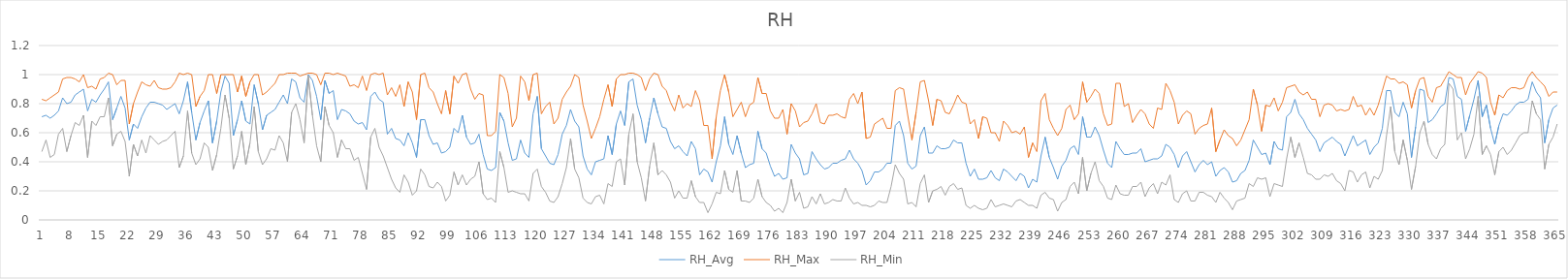
| Category | RH_Avg | RH_Max | RH_Min |
|---|---|---|---|
| 0 | 0.71 | 0.83 | 0.47 |
| 1 | 0.72 | 0.82 | 0.55 |
| 2 | 0.7 | 0.84 | 0.43 |
| 3 | 0.72 | 0.86 | 0.45 |
| 4 | 0.75 | 0.88 | 0.59 |
| 5 | 0.84 | 0.97 | 0.63 |
| 6 | 0.8 | 0.98 | 0.47 |
| 7 | 0.81 | 0.98 | 0.58 |
| 8 | 0.86 | 0.97 | 0.67 |
| 9 | 0.88 | 0.95 | 0.65 |
| 10 | 0.9 | 1 | 0.72 |
| 11 | 0.75 | 0.91 | 0.43 |
| 12 | 0.83 | 0.92 | 0.68 |
| 13 | 0.81 | 0.9 | 0.65 |
| 14 | 0.86 | 0.97 | 0.71 |
| 15 | 0.9 | 0.98 | 0.71 |
| 16 | 0.95 | 1.01 | 0.84 |
| 17 | 0.69 | 1 | 0.51 |
| 18 | 0.77 | 0.93 | 0.59 |
| 19 | 0.85 | 0.96 | 0.61 |
| 20 | 0.77 | 0.96 | 0.54 |
| 21 | 0.55 | 0.66 | 0.3 |
| 22 | 0.66 | 0.8 | 0.52 |
| 23 | 0.63 | 0.88 | 0.44 |
| 24 | 0.71 | 0.95 | 0.55 |
| 25 | 0.77 | 0.93 | 0.46 |
| 26 | 0.81 | 0.92 | 0.58 |
| 27 | 0.81 | 0.96 | 0.55 |
| 28 | 0.8 | 0.91 | 0.52 |
| 29 | 0.79 | 0.9 | 0.54 |
| 30 | 0.76 | 0.9 | 0.55 |
| 31 | 0.78 | 0.91 | 0.58 |
| 32 | 0.8 | 0.95 | 0.61 |
| 33 | 0.73 | 1.01 | 0.36 |
| 34 | 0.82 | 1 | 0.44 |
| 35 | 0.95 | 1.01 | 0.75 |
| 36 | 0.74 | 1 | 0.46 |
| 37 | 0.55 | 0.78 | 0.38 |
| 38 | 0.67 | 0.85 | 0.42 |
| 39 | 0.75 | 0.89 | 0.53 |
| 40 | 0.82 | 1 | 0.5 |
| 41 | 0.53 | 1 | 0.34 |
| 42 | 0.68 | 0.87 | 0.45 |
| 43 | 0.88 | 1 | 0.63 |
| 44 | 0.99 | 1 | 0.86 |
| 45 | 0.94 | 1 | 0.7 |
| 46 | 0.58 | 1 | 0.35 |
| 47 | 0.69 | 0.88 | 0.44 |
| 48 | 0.82 | 0.99 | 0.61 |
| 49 | 0.68 | 0.85 | 0.38 |
| 50 | 0.66 | 0.95 | 0.53 |
| 51 | 0.93 | 1 | 0.78 |
| 52 | 0.8 | 1 | 0.47 |
| 53 | 0.62 | 0.86 | 0.38 |
| 54 | 0.72 | 0.88 | 0.42 |
| 55 | 0.74 | 0.91 | 0.49 |
| 56 | 0.76 | 0.94 | 0.48 |
| 57 | 0.81 | 1 | 0.58 |
| 58 | 0.86 | 1 | 0.53 |
| 59 | 0.8 | 1.01 | 0.4 |
| 60 | 0.97 | 1.01 | 0.74 |
| 61 | 0.95 | 1.01 | 0.8 |
| 62 | 0.84 | 0.99 | 0.69 |
| 63 | 0.81 | 1 | 0.53 |
| 64 | 1 | 1.01 | 0.99 |
| 65 | 0.96 | 1.01 | 0.72 |
| 66 | 0.85 | 1 | 0.51 |
| 67 | 0.69 | 0.93 | 0.4 |
| 68 | 0.96 | 1.01 | 0.78 |
| 69 | 0.87 | 1.01 | 0.65 |
| 70 | 0.89 | 1 | 0.6 |
| 71 | 0.69 | 1.01 | 0.43 |
| 72 | 0.76 | 1 | 0.55 |
| 73 | 0.75 | 0.99 | 0.49 |
| 74 | 0.73 | 0.92 | 0.49 |
| 75 | 0.68 | 0.93 | 0.41 |
| 76 | 0.66 | 0.91 | 0.43 |
| 77 | 0.67 | 0.99 | 0.32 |
| 78 | 0.62 | 0.89 | 0.21 |
| 79 | 0.85 | 1 | 0.57 |
| 80 | 0.88 | 1.01 | 0.63 |
| 81 | 0.83 | 1 | 0.5 |
| 82 | 0.81 | 1.01 | 0.44 |
| 83 | 0.59 | 0.86 | 0.36 |
| 84 | 0.63 | 0.91 | 0.28 |
| 85 | 0.56 | 0.85 | 0.22 |
| 86 | 0.55 | 0.93 | 0.19 |
| 87 | 0.51 | 0.78 | 0.31 |
| 88 | 0.6 | 0.95 | 0.26 |
| 89 | 0.53 | 0.88 | 0.17 |
| 90 | 0.43 | 0.69 | 0.2 |
| 91 | 0.69 | 1 | 0.35 |
| 92 | 0.69 | 1.01 | 0.31 |
| 93 | 0.58 | 0.91 | 0.23 |
| 94 | 0.52 | 0.88 | 0.22 |
| 95 | 0.53 | 0.8 | 0.26 |
| 96 | 0.46 | 0.73 | 0.23 |
| 97 | 0.47 | 0.89 | 0.13 |
| 98 | 0.5 | 0.73 | 0.17 |
| 99 | 0.63 | 0.99 | 0.33 |
| 100 | 0.6 | 0.94 | 0.24 |
| 101 | 0.72 | 1 | 0.31 |
| 102 | 0.57 | 1.01 | 0.24 |
| 103 | 0.52 | 0.9 | 0.28 |
| 104 | 0.53 | 0.83 | 0.3 |
| 105 | 0.59 | 0.87 | 0.4 |
| 106 | 0.45 | 0.86 | 0.18 |
| 107 | 0.35 | 0.58 | 0.14 |
| 108 | 0.34 | 0.58 | 0.15 |
| 109 | 0.36 | 0.61 | 0.12 |
| 110 | 0.74 | 1 | 0.47 |
| 111 | 0.68 | 0.98 | 0.36 |
| 112 | 0.53 | 0.87 | 0.19 |
| 113 | 0.41 | 0.64 | 0.2 |
| 114 | 0.42 | 0.7 | 0.19 |
| 115 | 0.55 | 0.99 | 0.18 |
| 116 | 0.46 | 0.95 | 0.18 |
| 117 | 0.43 | 0.82 | 0.13 |
| 118 | 0.73 | 1 | 0.32 |
| 119 | 0.85 | 1.01 | 0.35 |
| 120 | 0.49 | 0.73 | 0.23 |
| 121 | 0.44 | 0.78 | 0.19 |
| 122 | 0.39 | 0.81 | 0.13 |
| 123 | 0.38 | 0.66 | 0.12 |
| 124 | 0.45 | 0.7 | 0.16 |
| 125 | 0.59 | 0.83 | 0.25 |
| 126 | 0.65 | 0.88 | 0.36 |
| 127 | 0.76 | 0.92 | 0.56 |
| 128 | 0.68 | 1 | 0.35 |
| 129 | 0.64 | 0.98 | 0.29 |
| 130 | 0.44 | 0.79 | 0.15 |
| 131 | 0.35 | 0.68 | 0.12 |
| 132 | 0.31 | 0.56 | 0.11 |
| 133 | 0.4 | 0.63 | 0.16 |
| 134 | 0.41 | 0.71 | 0.17 |
| 135 | 0.42 | 0.83 | 0.11 |
| 136 | 0.58 | 0.93 | 0.25 |
| 137 | 0.45 | 0.78 | 0.23 |
| 138 | 0.66 | 0.97 | 0.4 |
| 139 | 0.75 | 1 | 0.42 |
| 140 | 0.65 | 1 | 0.24 |
| 141 | 0.95 | 1.01 | 0.59 |
| 142 | 0.97 | 1.01 | 0.73 |
| 143 | 0.79 | 1 | 0.4 |
| 144 | 0.69 | 0.98 | 0.29 |
| 145 | 0.53 | 0.89 | 0.13 |
| 146 | 0.7 | 0.97 | 0.37 |
| 147 | 0.84 | 1.01 | 0.53 |
| 148 | 0.73 | 1 | 0.31 |
| 149 | 0.64 | 0.92 | 0.34 |
| 150 | 0.63 | 0.89 | 0.31 |
| 151 | 0.54 | 0.81 | 0.26 |
| 152 | 0.49 | 0.75 | 0.15 |
| 153 | 0.51 | 0.86 | 0.2 |
| 154 | 0.47 | 0.77 | 0.15 |
| 155 | 0.44 | 0.8 | 0.15 |
| 156 | 0.54 | 0.78 | 0.27 |
| 157 | 0.49 | 0.89 | 0.16 |
| 158 | 0.31 | 0.82 | 0.12 |
| 159 | 0.35 | 0.65 | 0.12 |
| 160 | 0.33 | 0.65 | 0.05 |
| 161 | 0.26 | 0.42 | 0.11 |
| 162 | 0.4 | 0.71 | 0.19 |
| 163 | 0.51 | 0.89 | 0.18 |
| 164 | 0.71 | 1 | 0.34 |
| 165 | 0.52 | 0.88 | 0.21 |
| 166 | 0.45 | 0.71 | 0.19 |
| 167 | 0.58 | 0.76 | 0.34 |
| 168 | 0.46 | 0.81 | 0.13 |
| 169 | 0.36 | 0.71 | 0.13 |
| 170 | 0.38 | 0.79 | 0.12 |
| 171 | 0.39 | 0.81 | 0.15 |
| 172 | 0.61 | 0.98 | 0.28 |
| 173 | 0.49 | 0.87 | 0.16 |
| 174 | 0.46 | 0.87 | 0.12 |
| 175 | 0.37 | 0.75 | 0.1 |
| 176 | 0.3 | 0.7 | 0.06 |
| 177 | 0.32 | 0.7 | 0.08 |
| 178 | 0.28 | 0.76 | 0.05 |
| 179 | 0.29 | 0.59 | 0.12 |
| 180 | 0.52 | 0.8 | 0.28 |
| 181 | 0.46 | 0.75 | 0.13 |
| 182 | 0.42 | 0.64 | 0.19 |
| 183 | 0.31 | 0.67 | 0.08 |
| 184 | 0.32 | 0.68 | 0.09 |
| 185 | 0.47 | 0.73 | 0.16 |
| 186 | 0.42 | 0.8 | 0.11 |
| 187 | 0.38 | 0.67 | 0.18 |
| 188 | 0.35 | 0.66 | 0.11 |
| 189 | 0.36 | 0.72 | 0.12 |
| 190 | 0.39 | 0.72 | 0.14 |
| 191 | 0.39 | 0.73 | 0.13 |
| 192 | 0.41 | 0.71 | 0.13 |
| 193 | 0.42 | 0.7 | 0.22 |
| 194 | 0.48 | 0.83 | 0.15 |
| 195 | 0.42 | 0.87 | 0.11 |
| 196 | 0.39 | 0.8 | 0.12 |
| 197 | 0.34 | 0.88 | 0.1 |
| 198 | 0.24 | 0.56 | 0.1 |
| 199 | 0.27 | 0.57 | 0.09 |
| 200 | 0.33 | 0.66 | 0.1 |
| 201 | 0.33 | 0.68 | 0.13 |
| 202 | 0.35 | 0.7 | 0.12 |
| 203 | 0.39 | 0.63 | 0.12 |
| 204 | 0.39 | 0.63 | 0.23 |
| 205 | 0.65 | 0.89 | 0.38 |
| 206 | 0.68 | 0.91 | 0.32 |
| 207 | 0.58 | 0.9 | 0.28 |
| 208 | 0.39 | 0.72 | 0.11 |
| 209 | 0.35 | 0.55 | 0.12 |
| 210 | 0.37 | 0.74 | 0.09 |
| 211 | 0.58 | 0.95 | 0.25 |
| 212 | 0.64 | 0.96 | 0.31 |
| 213 | 0.46 | 0.82 | 0.12 |
| 214 | 0.46 | 0.65 | 0.2 |
| 215 | 0.51 | 0.83 | 0.21 |
| 216 | 0.49 | 0.82 | 0.23 |
| 217 | 0.49 | 0.74 | 0.17 |
| 218 | 0.5 | 0.73 | 0.23 |
| 219 | 0.55 | 0.79 | 0.25 |
| 220 | 0.53 | 0.86 | 0.21 |
| 221 | 0.53 | 0.81 | 0.22 |
| 222 | 0.39 | 0.8 | 0.1 |
| 223 | 0.3 | 0.66 | 0.08 |
| 224 | 0.35 | 0.69 | 0.1 |
| 225 | 0.28 | 0.56 | 0.08 |
| 226 | 0.28 | 0.71 | 0.07 |
| 227 | 0.29 | 0.7 | 0.08 |
| 228 | 0.34 | 0.6 | 0.14 |
| 229 | 0.29 | 0.6 | 0.09 |
| 230 | 0.27 | 0.54 | 0.1 |
| 231 | 0.35 | 0.68 | 0.11 |
| 232 | 0.33 | 0.65 | 0.1 |
| 233 | 0.3 | 0.6 | 0.09 |
| 234 | 0.27 | 0.61 | 0.13 |
| 235 | 0.32 | 0.59 | 0.14 |
| 236 | 0.3 | 0.64 | 0.12 |
| 237 | 0.22 | 0.43 | 0.1 |
| 238 | 0.28 | 0.53 | 0.1 |
| 239 | 0.26 | 0.47 | 0.08 |
| 240 | 0.44 | 0.82 | 0.17 |
| 241 | 0.57 | 0.87 | 0.19 |
| 242 | 0.43 | 0.69 | 0.15 |
| 243 | 0.36 | 0.63 | 0.14 |
| 244 | 0.28 | 0.58 | 0.06 |
| 245 | 0.37 | 0.63 | 0.12 |
| 246 | 0.41 | 0.76 | 0.14 |
| 247 | 0.49 | 0.79 | 0.23 |
| 248 | 0.51 | 0.69 | 0.26 |
| 249 | 0.45 | 0.73 | 0.18 |
| 250 | 0.71 | 0.95 | 0.43 |
| 251 | 0.57 | 0.81 | 0.2 |
| 252 | 0.57 | 0.85 | 0.32 |
| 253 | 0.64 | 0.9 | 0.4 |
| 254 | 0.58 | 0.87 | 0.27 |
| 255 | 0.48 | 0.73 | 0.23 |
| 256 | 0.39 | 0.65 | 0.15 |
| 257 | 0.36 | 0.66 | 0.14 |
| 258 | 0.54 | 0.94 | 0.24 |
| 259 | 0.49 | 0.94 | 0.18 |
| 260 | 0.45 | 0.78 | 0.17 |
| 261 | 0.45 | 0.8 | 0.17 |
| 262 | 0.46 | 0.67 | 0.23 |
| 263 | 0.46 | 0.72 | 0.23 |
| 264 | 0.49 | 0.76 | 0.26 |
| 265 | 0.4 | 0.73 | 0.16 |
| 266 | 0.41 | 0.66 | 0.22 |
| 267 | 0.42 | 0.63 | 0.25 |
| 268 | 0.42 | 0.77 | 0.18 |
| 269 | 0.44 | 0.76 | 0.26 |
| 270 | 0.52 | 0.94 | 0.24 |
| 271 | 0.5 | 0.89 | 0.31 |
| 272 | 0.45 | 0.81 | 0.14 |
| 273 | 0.36 | 0.66 | 0.12 |
| 274 | 0.44 | 0.72 | 0.18 |
| 275 | 0.47 | 0.75 | 0.2 |
| 276 | 0.4 | 0.73 | 0.13 |
| 277 | 0.33 | 0.59 | 0.13 |
| 278 | 0.38 | 0.63 | 0.19 |
| 279 | 0.41 | 0.65 | 0.19 |
| 280 | 0.38 | 0.66 | 0.17 |
| 281 | 0.4 | 0.77 | 0.16 |
| 282 | 0.3 | 0.47 | 0.12 |
| 283 | 0.34 | 0.55 | 0.19 |
| 284 | 0.36 | 0.62 | 0.15 |
| 285 | 0.33 | 0.58 | 0.12 |
| 286 | 0.26 | 0.56 | 0.07 |
| 287 | 0.27 | 0.51 | 0.13 |
| 288 | 0.32 | 0.55 | 0.14 |
| 289 | 0.34 | 0.62 | 0.15 |
| 290 | 0.41 | 0.69 | 0.25 |
| 291 | 0.55 | 0.9 | 0.23 |
| 292 | 0.5 | 0.79 | 0.29 |
| 293 | 0.45 | 0.61 | 0.28 |
| 294 | 0.46 | 0.79 | 0.29 |
| 295 | 0.38 | 0.78 | 0.16 |
| 296 | 0.54 | 0.84 | 0.25 |
| 297 | 0.49 | 0.75 | 0.24 |
| 298 | 0.48 | 0.81 | 0.23 |
| 299 | 0.71 | 0.91 | 0.42 |
| 300 | 0.74 | 0.92 | 0.57 |
| 301 | 0.83 | 0.93 | 0.43 |
| 302 | 0.73 | 0.88 | 0.53 |
| 303 | 0.69 | 0.86 | 0.43 |
| 304 | 0.63 | 0.88 | 0.32 |
| 305 | 0.59 | 0.83 | 0.31 |
| 306 | 0.55 | 0.83 | 0.28 |
| 307 | 0.47 | 0.71 | 0.28 |
| 308 | 0.53 | 0.79 | 0.31 |
| 309 | 0.55 | 0.8 | 0.3 |
| 310 | 0.57 | 0.79 | 0.32 |
| 311 | 0.54 | 0.75 | 0.27 |
| 312 | 0.52 | 0.76 | 0.25 |
| 313 | 0.44 | 0.75 | 0.2 |
| 314 | 0.51 | 0.76 | 0.34 |
| 315 | 0.58 | 0.85 | 0.33 |
| 316 | 0.51 | 0.78 | 0.26 |
| 317 | 0.53 | 0.79 | 0.31 |
| 318 | 0.55 | 0.72 | 0.33 |
| 319 | 0.45 | 0.77 | 0.22 |
| 320 | 0.5 | 0.72 | 0.3 |
| 321 | 0.53 | 0.79 | 0.28 |
| 322 | 0.63 | 0.89 | 0.34 |
| 323 | 0.89 | 0.99 | 0.58 |
| 324 | 0.89 | 0.97 | 0.78 |
| 325 | 0.74 | 0.97 | 0.47 |
| 326 | 0.71 | 0.94 | 0.38 |
| 327 | 0.81 | 0.95 | 0.55 |
| 328 | 0.73 | 0.93 | 0.41 |
| 329 | 0.43 | 0.77 | 0.21 |
| 330 | 0.64 | 0.89 | 0.37 |
| 331 | 0.9 | 0.97 | 0.6 |
| 332 | 0.89 | 0.98 | 0.68 |
| 333 | 0.67 | 0.85 | 0.52 |
| 334 | 0.69 | 0.81 | 0.45 |
| 335 | 0.73 | 0.91 | 0.42 |
| 336 | 0.78 | 0.92 | 0.49 |
| 337 | 0.8 | 0.97 | 0.52 |
| 338 | 0.98 | 1.02 | 0.94 |
| 339 | 0.97 | 1 | 0.9 |
| 340 | 0.85 | 0.98 | 0.55 |
| 341 | 0.83 | 0.98 | 0.6 |
| 342 | 0.61 | 0.86 | 0.42 |
| 343 | 0.72 | 0.94 | 0.49 |
| 344 | 0.83 | 0.98 | 0.59 |
| 345 | 0.96 | 1.02 | 0.85 |
| 346 | 0.71 | 1.01 | 0.45 |
| 347 | 0.79 | 0.98 | 0.51 |
| 348 | 0.63 | 0.81 | 0.45 |
| 349 | 0.52 | 0.72 | 0.31 |
| 350 | 0.65 | 0.86 | 0.47 |
| 351 | 0.73 | 0.84 | 0.5 |
| 352 | 0.72 | 0.89 | 0.45 |
| 353 | 0.75 | 0.91 | 0.48 |
| 354 | 0.79 | 0.91 | 0.53 |
| 355 | 0.81 | 0.9 | 0.58 |
| 356 | 0.81 | 0.91 | 0.6 |
| 357 | 0.83 | 0.98 | 0.6 |
| 358 | 0.95 | 1.02 | 0.82 |
| 359 | 0.88 | 0.98 | 0.73 |
| 360 | 0.84 | 0.95 | 0.69 |
| 361 | 0.53 | 0.92 | 0.35 |
| 362 | 0.69 | 0.85 | 0.52 |
| 363 | 0.77 | 0.88 | 0.57 |
| 364 | 0.79 | 0.88 | 0.66 |